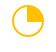
| Category | Series 0 |
|---|---|
| 0 | 25 |
| 1 | 75 |